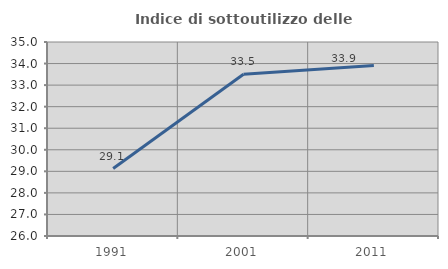
| Category | Indice di sottoutilizzo delle abitazioni  |
|---|---|
| 1991.0 | 29.131 |
| 2001.0 | 33.504 |
| 2011.0 | 33.912 |